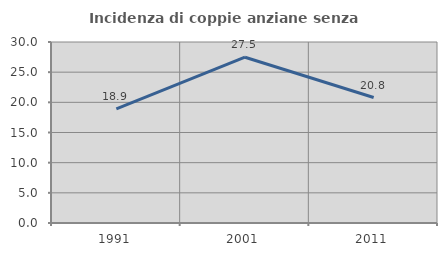
| Category | Incidenza di coppie anziane senza figli  |
|---|---|
| 1991.0 | 18.919 |
| 2001.0 | 27.481 |
| 2011.0 | 20.792 |